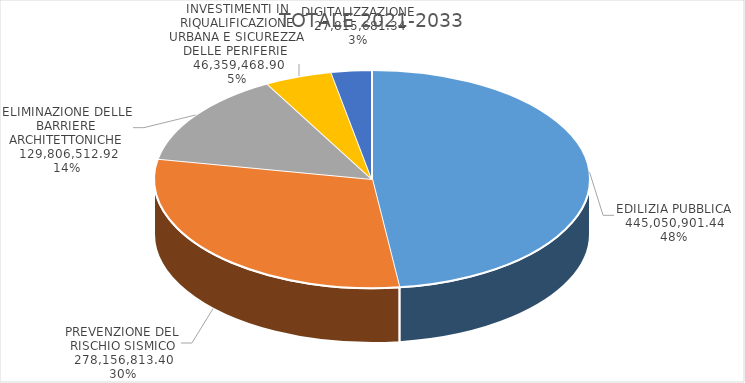
| Category | TOTALE 2021-2033 |
|---|---|
| EDILIZIA PUBBLICA | 445050901.44 |
| PREVENZIONE DEL RISCHIO SISMICO | 278156813.4 |
| ELIMINAZIONE DELLE BARRIERE ARCHITETTONICHE | 129806512.92 |
| INVESTIMENTI IN RIQUALIFICAZIONE URBANA E SICUREZZA DELLE PERIFERIE  | 46359468.9 |
| DIGITALIZZAZIONE | 27815681.34 |